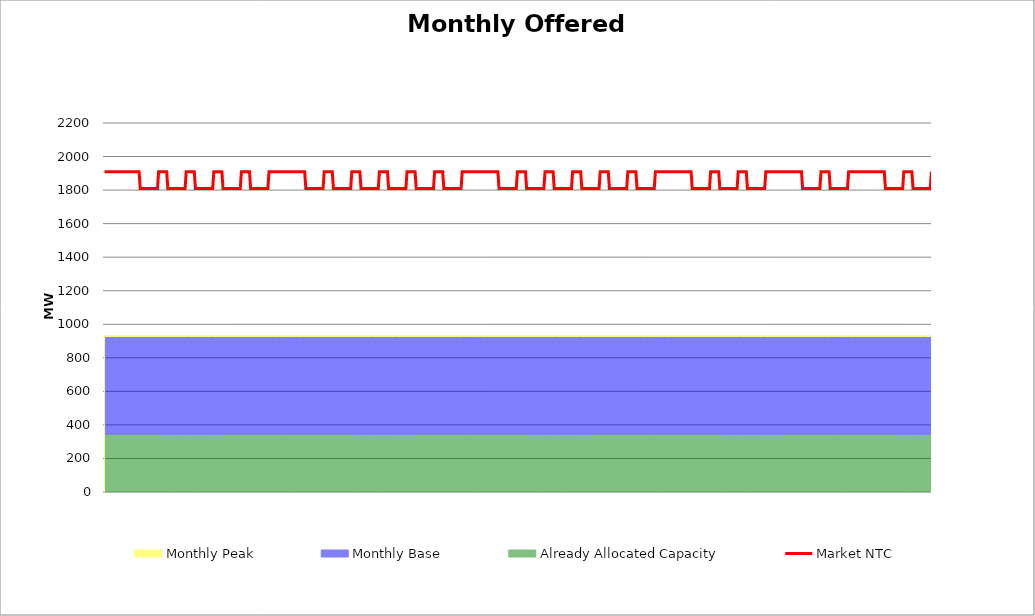
| Category | Market NTC |
|---|---|
| 0 | 1910 |
| 1 | 1910 |
| 2 | 1910 |
| 3 | 1910 |
| 4 | 1910 |
| 5 | 1910 |
| 6 | 1910 |
| 7 | 1910 |
| 8 | 1910 |
| 9 | 1910 |
| 10 | 1910 |
| 11 | 1910 |
| 12 | 1910 |
| 13 | 1910 |
| 14 | 1910 |
| 15 | 1910 |
| 16 | 1910 |
| 17 | 1910 |
| 18 | 1910 |
| 19 | 1910 |
| 20 | 1910 |
| 21 | 1910 |
| 22 | 1910 |
| 23 | 1910 |
| 24 | 1910 |
| 25 | 1910 |
| 26 | 1910 |
| 27 | 1910 |
| 28 | 1910 |
| 29 | 1910 |
| 30 | 1910 |
| 31 | 1810 |
| 32 | 1810 |
| 33 | 1810 |
| 34 | 1810 |
| 35 | 1810 |
| 36 | 1810 |
| 37 | 1810 |
| 38 | 1810 |
| 39 | 1810 |
| 40 | 1810 |
| 41 | 1810 |
| 42 | 1810 |
| 43 | 1810 |
| 44 | 1810 |
| 45 | 1810 |
| 46 | 1810 |
| 47 | 1910 |
| 48 | 1910 |
| 49 | 1910 |
| 50 | 1910 |
| 51 | 1910 |
| 52 | 1910 |
| 53 | 1910 |
| 54 | 1910 |
| 55 | 1810 |
| 56 | 1810 |
| 57 | 1810 |
| 58 | 1810 |
| 59 | 1810 |
| 60 | 1810 |
| 61 | 1810 |
| 62 | 1810 |
| 63 | 1810 |
| 64 | 1810 |
| 65 | 1810 |
| 66 | 1810 |
| 67 | 1810 |
| 68 | 1810 |
| 69 | 1810 |
| 70 | 1810 |
| 71 | 1910 |
| 72 | 1910 |
| 73 | 1910 |
| 74 | 1910 |
| 75 | 1910 |
| 76 | 1910 |
| 77 | 1910 |
| 78 | 1910 |
| 79 | 1810 |
| 80 | 1810 |
| 81 | 1810 |
| 82 | 1810 |
| 83 | 1810 |
| 84 | 1810 |
| 85 | 1810 |
| 86 | 1810 |
| 87 | 1810 |
| 88 | 1810 |
| 89 | 1810 |
| 90 | 1810 |
| 91 | 1810 |
| 92 | 1810 |
| 93 | 1810 |
| 94 | 1810 |
| 95 | 1910 |
| 96 | 1910 |
| 97 | 1910 |
| 98 | 1910 |
| 99 | 1910 |
| 100 | 1910 |
| 101 | 1910 |
| 102 | 1910 |
| 103 | 1810 |
| 104 | 1810 |
| 105 | 1810 |
| 106 | 1810 |
| 107 | 1810 |
| 108 | 1810 |
| 109 | 1810 |
| 110 | 1810 |
| 111 | 1810 |
| 112 | 1810 |
| 113 | 1810 |
| 114 | 1810 |
| 115 | 1810 |
| 116 | 1810 |
| 117 | 1810 |
| 118 | 1810 |
| 119 | 1910 |
| 120 | 1910 |
| 121 | 1910 |
| 122 | 1910 |
| 123 | 1910 |
| 124 | 1910 |
| 125 | 1910 |
| 126 | 1910 |
| 127 | 1810 |
| 128 | 1810 |
| 129 | 1810 |
| 130 | 1810 |
| 131 | 1810 |
| 132 | 1810 |
| 133 | 1810 |
| 134 | 1810 |
| 135 | 1810 |
| 136 | 1810 |
| 137 | 1810 |
| 138 | 1810 |
| 139 | 1810 |
| 140 | 1810 |
| 141 | 1810 |
| 142 | 1810 |
| 143 | 1910 |
| 144 | 1910 |
| 145 | 1910 |
| 146 | 1910 |
| 147 | 1910 |
| 148 | 1910 |
| 149 | 1910 |
| 150 | 1910 |
| 151 | 1910 |
| 152 | 1910 |
| 153 | 1910 |
| 154 | 1910 |
| 155 | 1910 |
| 156 | 1910 |
| 157 | 1910 |
| 158 | 1910 |
| 159 | 1910 |
| 160 | 1910 |
| 161 | 1910 |
| 162 | 1910 |
| 163 | 1910 |
| 164 | 1910 |
| 165 | 1910 |
| 166 | 1910 |
| 167 | 1910 |
| 168 | 1910 |
| 169 | 1910 |
| 170 | 1910 |
| 171 | 1910 |
| 172 | 1910 |
| 173 | 1910 |
| 174 | 1910 |
| 175 | 1810 |
| 176 | 1810 |
| 177 | 1810 |
| 178 | 1810 |
| 179 | 1810 |
| 180 | 1810 |
| 181 | 1810 |
| 182 | 1810 |
| 183 | 1810 |
| 184 | 1810 |
| 185 | 1810 |
| 186 | 1810 |
| 187 | 1810 |
| 188 | 1810 |
| 189 | 1810 |
| 190 | 1810 |
| 191 | 1910 |
| 192 | 1910 |
| 193 | 1910 |
| 194 | 1910 |
| 195 | 1910 |
| 196 | 1910 |
| 197 | 1910 |
| 198 | 1910 |
| 199 | 1810 |
| 200 | 1810 |
| 201 | 1810 |
| 202 | 1810 |
| 203 | 1810 |
| 204 | 1810 |
| 205 | 1810 |
| 206 | 1810 |
| 207 | 1810 |
| 208 | 1810 |
| 209 | 1810 |
| 210 | 1810 |
| 211 | 1810 |
| 212 | 1810 |
| 213 | 1810 |
| 214 | 1810 |
| 215 | 1910 |
| 216 | 1910 |
| 217 | 1910 |
| 218 | 1910 |
| 219 | 1910 |
| 220 | 1910 |
| 221 | 1910 |
| 222 | 1910 |
| 223 | 1810 |
| 224 | 1810 |
| 225 | 1810 |
| 226 | 1810 |
| 227 | 1810 |
| 228 | 1810 |
| 229 | 1810 |
| 230 | 1810 |
| 231 | 1810 |
| 232 | 1810 |
| 233 | 1810 |
| 234 | 1810 |
| 235 | 1810 |
| 236 | 1810 |
| 237 | 1810 |
| 238 | 1810 |
| 239 | 1910 |
| 240 | 1910 |
| 241 | 1910 |
| 242 | 1910 |
| 243 | 1910 |
| 244 | 1910 |
| 245 | 1910 |
| 246 | 1910 |
| 247 | 1810 |
| 248 | 1810 |
| 249 | 1810 |
| 250 | 1810 |
| 251 | 1810 |
| 252 | 1810 |
| 253 | 1810 |
| 254 | 1810 |
| 255 | 1810 |
| 256 | 1810 |
| 257 | 1810 |
| 258 | 1810 |
| 259 | 1810 |
| 260 | 1810 |
| 261 | 1810 |
| 262 | 1810 |
| 263 | 1910 |
| 264 | 1910 |
| 265 | 1910 |
| 266 | 1910 |
| 267 | 1910 |
| 268 | 1910 |
| 269 | 1910 |
| 270 | 1910 |
| 271 | 1810 |
| 272 | 1810 |
| 273 | 1810 |
| 274 | 1810 |
| 275 | 1810 |
| 276 | 1810 |
| 277 | 1810 |
| 278 | 1810 |
| 279 | 1810 |
| 280 | 1810 |
| 281 | 1810 |
| 282 | 1810 |
| 283 | 1810 |
| 284 | 1810 |
| 285 | 1810 |
| 286 | 1810 |
| 287 | 1910 |
| 288 | 1910 |
| 289 | 1910 |
| 290 | 1910 |
| 291 | 1910 |
| 292 | 1910 |
| 293 | 1910 |
| 294 | 1910 |
| 295 | 1810 |
| 296 | 1810 |
| 297 | 1810 |
| 298 | 1810 |
| 299 | 1810 |
| 300 | 1810 |
| 301 | 1810 |
| 302 | 1810 |
| 303 | 1810 |
| 304 | 1810 |
| 305 | 1810 |
| 306 | 1810 |
| 307 | 1810 |
| 308 | 1810 |
| 309 | 1810 |
| 310 | 1810 |
| 311 | 1910 |
| 312 | 1910 |
| 313 | 1910 |
| 314 | 1910 |
| 315 | 1910 |
| 316 | 1910 |
| 317 | 1910 |
| 318 | 1910 |
| 319 | 1910 |
| 320 | 1910 |
| 321 | 1910 |
| 322 | 1910 |
| 323 | 1910 |
| 324 | 1910 |
| 325 | 1910 |
| 326 | 1910 |
| 327 | 1910 |
| 328 | 1910 |
| 329 | 1910 |
| 330 | 1910 |
| 331 | 1910 |
| 332 | 1910 |
| 333 | 1910 |
| 334 | 1910 |
| 335 | 1910 |
| 336 | 1910 |
| 337 | 1910 |
| 338 | 1910 |
| 339 | 1910 |
| 340 | 1910 |
| 341 | 1910 |
| 342 | 1910 |
| 343 | 1810 |
| 344 | 1810 |
| 345 | 1810 |
| 346 | 1810 |
| 347 | 1810 |
| 348 | 1810 |
| 349 | 1810 |
| 350 | 1810 |
| 351 | 1810 |
| 352 | 1810 |
| 353 | 1810 |
| 354 | 1810 |
| 355 | 1810 |
| 356 | 1810 |
| 357 | 1810 |
| 358 | 1810 |
| 359 | 1910 |
| 360 | 1910 |
| 361 | 1910 |
| 362 | 1910 |
| 363 | 1910 |
| 364 | 1910 |
| 365 | 1910 |
| 366 | 1910 |
| 367 | 1810 |
| 368 | 1810 |
| 369 | 1810 |
| 370 | 1810 |
| 371 | 1810 |
| 372 | 1810 |
| 373 | 1810 |
| 374 | 1810 |
| 375 | 1810 |
| 376 | 1810 |
| 377 | 1810 |
| 378 | 1810 |
| 379 | 1810 |
| 380 | 1810 |
| 381 | 1810 |
| 382 | 1810 |
| 383 | 1910 |
| 384 | 1910 |
| 385 | 1910 |
| 386 | 1910 |
| 387 | 1910 |
| 388 | 1910 |
| 389 | 1910 |
| 390 | 1910 |
| 391 | 1810 |
| 392 | 1810 |
| 393 | 1810 |
| 394 | 1810 |
| 395 | 1810 |
| 396 | 1810 |
| 397 | 1810 |
| 398 | 1810 |
| 399 | 1810 |
| 400 | 1810 |
| 401 | 1810 |
| 402 | 1810 |
| 403 | 1810 |
| 404 | 1810 |
| 405 | 1810 |
| 406 | 1810 |
| 407 | 1910 |
| 408 | 1910 |
| 409 | 1910 |
| 410 | 1910 |
| 411 | 1910 |
| 412 | 1910 |
| 413 | 1910 |
| 414 | 1910 |
| 415 | 1810 |
| 416 | 1810 |
| 417 | 1810 |
| 418 | 1810 |
| 419 | 1810 |
| 420 | 1810 |
| 421 | 1810 |
| 422 | 1810 |
| 423 | 1810 |
| 424 | 1810 |
| 425 | 1810 |
| 426 | 1810 |
| 427 | 1810 |
| 428 | 1810 |
| 429 | 1810 |
| 430 | 1810 |
| 431 | 1910 |
| 432 | 1910 |
| 433 | 1910 |
| 434 | 1910 |
| 435 | 1910 |
| 436 | 1910 |
| 437 | 1910 |
| 438 | 1910 |
| 439 | 1810 |
| 440 | 1810 |
| 441 | 1810 |
| 442 | 1810 |
| 443 | 1810 |
| 444 | 1810 |
| 445 | 1810 |
| 446 | 1810 |
| 447 | 1810 |
| 448 | 1810 |
| 449 | 1810 |
| 450 | 1810 |
| 451 | 1810 |
| 452 | 1810 |
| 453 | 1810 |
| 454 | 1810 |
| 455 | 1910 |
| 456 | 1910 |
| 457 | 1910 |
| 458 | 1910 |
| 459 | 1910 |
| 460 | 1910 |
| 461 | 1910 |
| 462 | 1910 |
| 463 | 1810 |
| 464 | 1810 |
| 465 | 1810 |
| 466 | 1810 |
| 467 | 1810 |
| 468 | 1810 |
| 469 | 1810 |
| 470 | 1810 |
| 471 | 1810 |
| 472 | 1810 |
| 473 | 1810 |
| 474 | 1810 |
| 475 | 1810 |
| 476 | 1810 |
| 477 | 1810 |
| 478 | 1810 |
| 479 | 1910 |
| 480 | 1910 |
| 481 | 1910 |
| 482 | 1910 |
| 483 | 1910 |
| 484 | 1910 |
| 485 | 1910 |
| 486 | 1910 |
| 487 | 1910 |
| 488 | 1910 |
| 489 | 1910 |
| 490 | 1910 |
| 491 | 1910 |
| 492 | 1910 |
| 493 | 1910 |
| 494 | 1910 |
| 495 | 1910 |
| 496 | 1910 |
| 497 | 1910 |
| 498 | 1910 |
| 499 | 1910 |
| 500 | 1910 |
| 501 | 1910 |
| 502 | 1910 |
| 503 | 1910 |
| 504 | 1910 |
| 505 | 1910 |
| 506 | 1910 |
| 507 | 1910 |
| 508 | 1910 |
| 509 | 1910 |
| 510 | 1910 |
| 511 | 1810 |
| 512 | 1810 |
| 513 | 1810 |
| 514 | 1810 |
| 515 | 1810 |
| 516 | 1810 |
| 517 | 1810 |
| 518 | 1810 |
| 519 | 1810 |
| 520 | 1810 |
| 521 | 1810 |
| 522 | 1810 |
| 523 | 1810 |
| 524 | 1810 |
| 525 | 1810 |
| 526 | 1810 |
| 527 | 1910 |
| 528 | 1910 |
| 529 | 1910 |
| 530 | 1910 |
| 531 | 1910 |
| 532 | 1910 |
| 533 | 1910 |
| 534 | 1910 |
| 535 | 1810 |
| 536 | 1810 |
| 537 | 1810 |
| 538 | 1810 |
| 539 | 1810 |
| 540 | 1810 |
| 541 | 1810 |
| 542 | 1810 |
| 543 | 1810 |
| 544 | 1810 |
| 545 | 1810 |
| 546 | 1810 |
| 547 | 1810 |
| 548 | 1810 |
| 549 | 1810 |
| 550 | 1810 |
| 551 | 1910 |
| 552 | 1910 |
| 553 | 1910 |
| 554 | 1910 |
| 555 | 1910 |
| 556 | 1910 |
| 557 | 1910 |
| 558 | 1910 |
| 559 | 1810 |
| 560 | 1810 |
| 561 | 1810 |
| 562 | 1810 |
| 563 | 1810 |
| 564 | 1810 |
| 565 | 1810 |
| 566 | 1810 |
| 567 | 1810 |
| 568 | 1810 |
| 569 | 1810 |
| 570 | 1810 |
| 571 | 1810 |
| 572 | 1810 |
| 573 | 1810 |
| 574 | 1810 |
| 575 | 1910 |
| 576 | 1910 |
| 577 | 1910 |
| 578 | 1910 |
| 579 | 1910 |
| 580 | 1910 |
| 581 | 1910 |
| 582 | 1910 |
| 583 | 1910 |
| 584 | 1910 |
| 585 | 1910 |
| 586 | 1910 |
| 587 | 1910 |
| 588 | 1910 |
| 589 | 1910 |
| 590 | 1910 |
| 591 | 1910 |
| 592 | 1910 |
| 593 | 1910 |
| 594 | 1910 |
| 595 | 1910 |
| 596 | 1910 |
| 597 | 1910 |
| 598 | 1910 |
| 599 | 1910 |
| 600 | 1910 |
| 601 | 1910 |
| 602 | 1910 |
| 603 | 1910 |
| 604 | 1910 |
| 605 | 1910 |
| 606 | 1910 |
| 607 | 1810 |
| 608 | 1810 |
| 609 | 1810 |
| 610 | 1810 |
| 611 | 1810 |
| 612 | 1810 |
| 613 | 1810 |
| 614 | 1810 |
| 615 | 1810 |
| 616 | 1810 |
| 617 | 1810 |
| 618 | 1810 |
| 619 | 1810 |
| 620 | 1810 |
| 621 | 1810 |
| 622 | 1810 |
| 623 | 1910 |
| 624 | 1910 |
| 625 | 1910 |
| 626 | 1910 |
| 627 | 1910 |
| 628 | 1910 |
| 629 | 1910 |
| 630 | 1910 |
| 631 | 1810 |
| 632 | 1810 |
| 633 | 1810 |
| 634 | 1810 |
| 635 | 1810 |
| 636 | 1810 |
| 637 | 1810 |
| 638 | 1810 |
| 639 | 1810 |
| 640 | 1810 |
| 641 | 1810 |
| 642 | 1810 |
| 643 | 1810 |
| 644 | 1810 |
| 645 | 1810 |
| 646 | 1810 |
| 647 | 1910 |
| 648 | 1910 |
| 649 | 1910 |
| 650 | 1910 |
| 651 | 1910 |
| 652 | 1910 |
| 653 | 1910 |
| 654 | 1910 |
| 655 | 1910 |
| 656 | 1910 |
| 657 | 1910 |
| 658 | 1910 |
| 659 | 1910 |
| 660 | 1910 |
| 661 | 1910 |
| 662 | 1910 |
| 663 | 1910 |
| 664 | 1910 |
| 665 | 1910 |
| 666 | 1910 |
| 667 | 1910 |
| 668 | 1910 |
| 669 | 1910 |
| 670 | 1910 |
| 671 | 1910 |
| 672 | 1910 |
| 673 | 1910 |
| 674 | 1910 |
| 675 | 1910 |
| 676 | 1910 |
| 677 | 1910 |
| 678 | 1910 |
| 679 | 1810 |
| 680 | 1810 |
| 681 | 1810 |
| 682 | 1810 |
| 683 | 1810 |
| 684 | 1810 |
| 685 | 1810 |
| 686 | 1810 |
| 687 | 1810 |
| 688 | 1810 |
| 689 | 1810 |
| 690 | 1810 |
| 691 | 1810 |
| 692 | 1810 |
| 693 | 1810 |
| 694 | 1810 |
| 695 | 1910 |
| 696 | 1910 |
| 697 | 1910 |
| 698 | 1910 |
| 699 | 1910 |
| 700 | 1910 |
| 701 | 1910 |
| 702 | 1910 |
| 703 | 1810 |
| 704 | 1810 |
| 705 | 1810 |
| 706 | 1810 |
| 707 | 1810 |
| 708 | 1810 |
| 709 | 1810 |
| 710 | 1810 |
| 711 | 1810 |
| 712 | 1810 |
| 713 | 1810 |
| 714 | 1810 |
| 715 | 1810 |
| 716 | 1810 |
| 717 | 1810 |
| 718 | 1810 |
| 719 | 1910 |